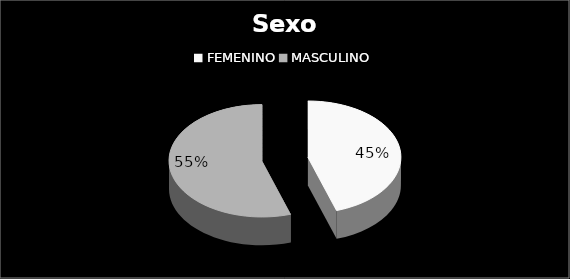
| Category | Series 0 |
|---|---|
| FEMENINO | 36 |
| MASCULINO | 44 |